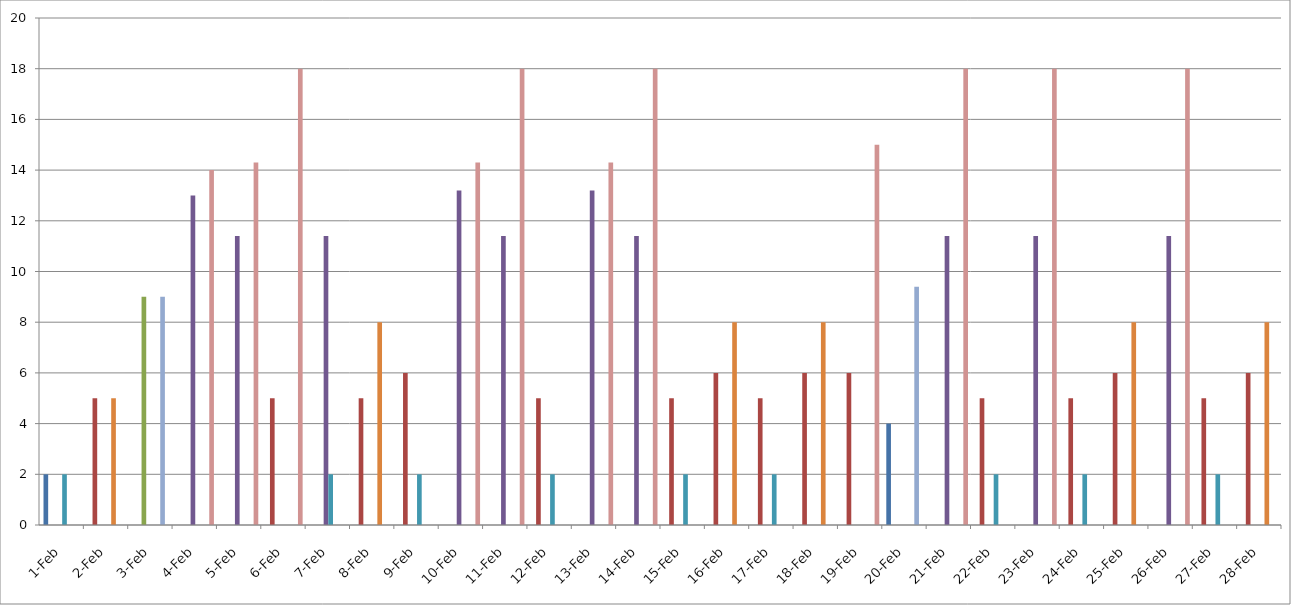
| Category | Series 0 | Series 1 | Series 2 | Series 3 | Series 4 | Series 5 | Series 6 | Series 7 |
|---|---|---|---|---|---|---|---|---|
| 2013-02-01 | 2 | 0 | 0 | 0 | 2 | 0 | 0 | 0 |
| 2013-02-02 | 0 | 5 | 0 | 0 | 0 | 5 | 0 | 0 |
| 2013-02-03 | 0 | 0 | 9 | 0 | 0 | 0 | 9 | 0 |
| 2013-02-04 | 0 | 0 | 0 | 13 | 0 | 0 | 0 | 14 |
| 2013-02-05 | 0 | 0 | 0 | 11.4 | 0 | 0 | 0 | 14.3 |
| 2013-02-06 | 0 | 5 | 0 | 0 | 0 | 0 | 0 | 18 |
| 2013-02-07 | 0 | 0 | 0 | 11.4 | 2 | 0 | 0 | 0 |
| 2013-02-08 | 0 | 5 | 0 | 0 | 0 | 8 | 0 | 0 |
| 2013-02-09 | 0 | 6 | 0 | 0 | 2 | 0 | 0 | 0 |
| 2013-02-10 | 0 | 0 | 0 | 13.2 | 0 | 0 | 0 | 14.3 |
| 2013-02-11 | 0 | 0 | 0 | 11.4 | 0 | 0 | 0 | 18 |
| 2013-02-12 | 0 | 5 | 0 | 0 | 2 | 0 | 0 | 0 |
| 2013-02-13 | 0 | 0 | 0 | 13.2 | 0 | 0 | 0 | 14.3 |
| 2013-02-14 | 0 | 0 | 0 | 11.4 | 0 | 0 | 0 | 18 |
| 2013-02-15 | 0 | 5 | 0 | 0 | 2 | 0 | 0 | 0 |
| 2013-02-16 | 0 | 6 | 0 | 0 | 0 | 8 | 0 | 0 |
| 2013-02-17 | 0 | 5 | 0 | 0 | 2 | 0 | 0 | 0 |
| 2013-02-18 | 0 | 6 | 0 | 0 | 0 | 8 | 0 | 0 |
| 2013-02-19 | 0 | 6 | 0 | 0 | 0 | 0 | 0 | 15 |
| 2013-02-20 | 4 | 0 | 0 | 0 | 0 | 0 | 9.4 | 0 |
| 2013-02-21 | 0 | 0 | 0 | 11.4 | 0 | 0 | 0 | 18 |
| 2013-02-22 | 0 | 5 | 0 | 0 | 2 | 0 | 0 | 0 |
| 2013-02-23 | 0 | 0 | 0 | 11.4 | 0 | 0 | 0 | 18 |
| 2013-02-24 | 0 | 5 | 0 | 0 | 2 | 0 | 0 | 0 |
| 2013-02-25 | 0 | 6 | 0 | 0 | 0 | 8 | 0 | 0 |
| 2013-02-26 | 0 | 0 | 0 | 11.4 | 0 | 0 | 0 | 18 |
| 2013-02-27 | 0 | 5 | 0 | 0 | 2 | 0 | 0 | 0 |
| 2013-02-28 | 0 | 6 | 0 | 0 | 0 | 8 | 0 | 0 |